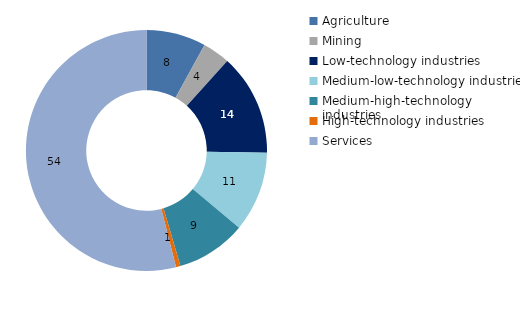
| Category | 1995 |
|---|---|
| Agriculture | 7.996 |
| Mining | 3.688 |
| Low-technology industries | 13.628 |
| Medium-low-technology industries | 10.75 |
| Medium-high-technology industries | 9.39 |
| High-technology industries | 0.602 |
| Services | 53.945 |